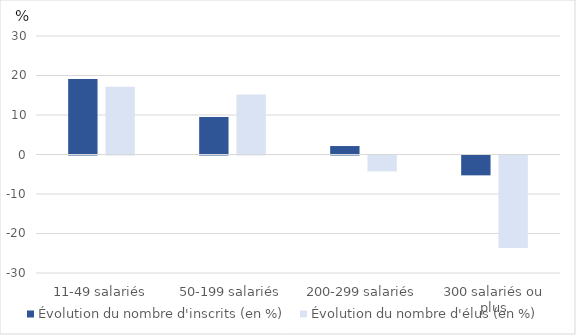
| Category | Évolution du nombre d'inscrits (en %) | Évolution du nombre d'élus (en %) |
|---|---|---|
| 11-49 salariés | 19.11 | 17.146 |
| 50-199 salariés | 9.478 | 15.212 |
| 200-299 salariés | 2.143 | -4.037 |
| 300 salariés ou plus | -5.024 | -23.437 |